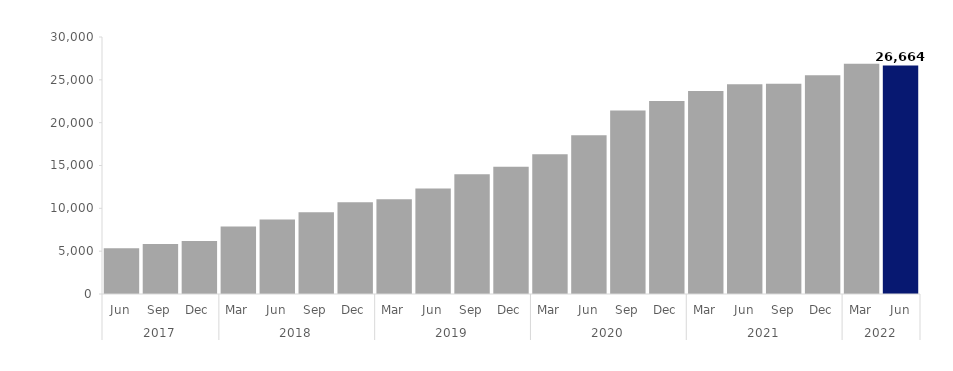
| Category | Series 0 |
|---|---|
| 0 | 5352 |
| 1 | 5844 |
| 2 | 6180 |
| 3 | 7890 |
| 4 | 8703 |
| 5 | 9537 |
| 6 | 10713 |
| 7 | 11067 |
| 8 | 12309 |
| 9 | 13965 |
| 10 | 14868 |
| 11 | 16308 |
| 12 | 18522 |
| 13 | 21414 |
| 14 | 22521 |
| 15 | 23688 |
| 16 | 24474 |
| 17 | 24546 |
| 18 | 25524 |
| 19 | 26868 |
| 20 | 26664 |